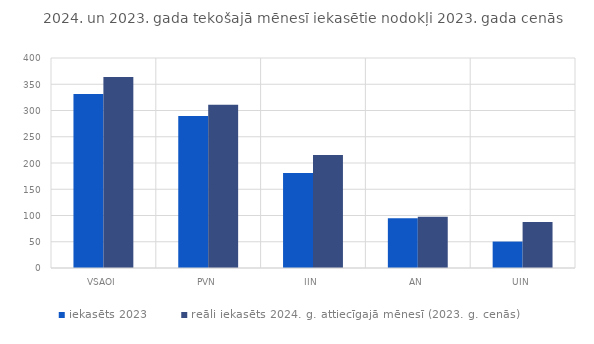
| Category | iekasēts 2023 | reāli iekasēts 2024. g. attiecīgajā mēnesī (2023. g. cenās) |
|---|---|---|
| VSAOI | 331.367 | 363.751 |
| PVN | 289.733 | 311.14 |
| IIN | 181.073 | 215.097 |
| AN | 94.582 | 97.674 |
| UIN | 50.345 | 87.607 |